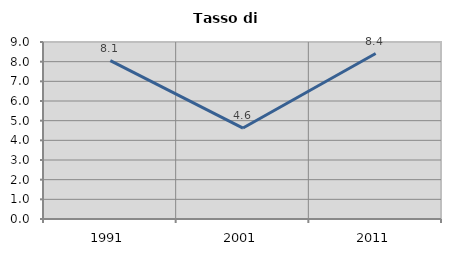
| Category | Tasso di disoccupazione   |
|---|---|
| 1991.0 | 8.056 |
| 2001.0 | 4.625 |
| 2011.0 | 8.412 |